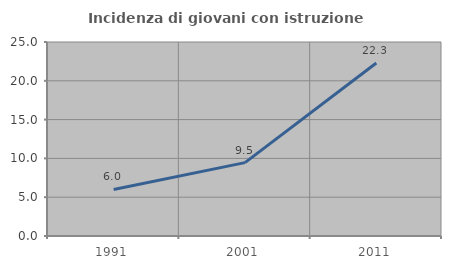
| Category | Incidenza di giovani con istruzione universitaria |
|---|---|
| 1991.0 | 5.996 |
| 2001.0 | 9.454 |
| 2011.0 | 22.297 |